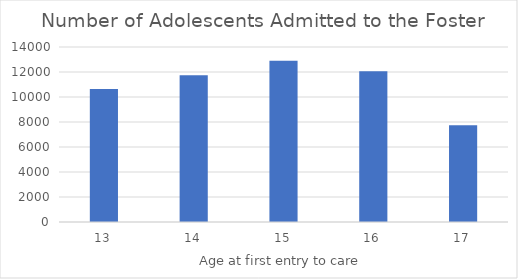
| Category | Series 0 |
|---|---|
| 13.0 | 10644 |
| 14.0 | 11741 |
| 15.0 | 12904 |
| 16.0 | 12059 |
| 17.0 | 7734 |